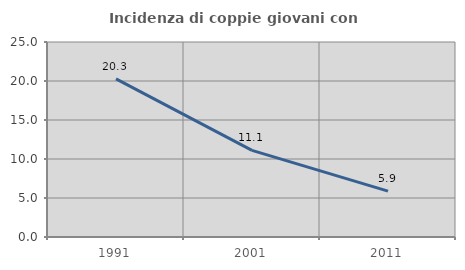
| Category | Incidenza di coppie giovani con figli |
|---|---|
| 1991.0 | 20.274 |
| 2001.0 | 11.1 |
| 2011.0 | 5.88 |